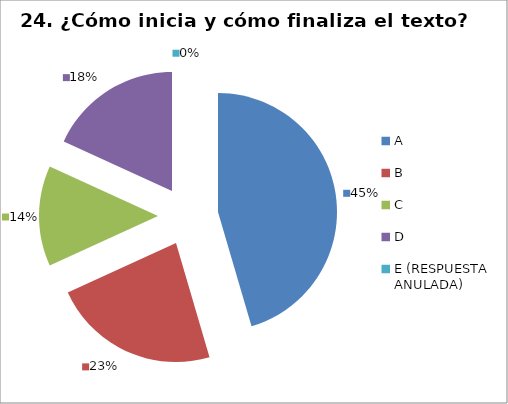
| Category | CANTIDAD DE RESPUESTAS PREGUNTA (23) | PORCENTAJE |
|---|---|---|
| A | 10 | 0.455 |
| B | 5 | 0.227 |
| C | 3 | 0.136 |
| D | 4 | 0.182 |
| E (RESPUESTA ANULADA) | 0 | 0 |